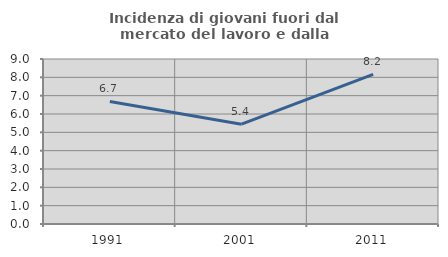
| Category | Incidenza di giovani fuori dal mercato del lavoro e dalla formazione  |
|---|---|
| 1991.0 | 6.686 |
| 2001.0 | 5.445 |
| 2011.0 | 8.163 |